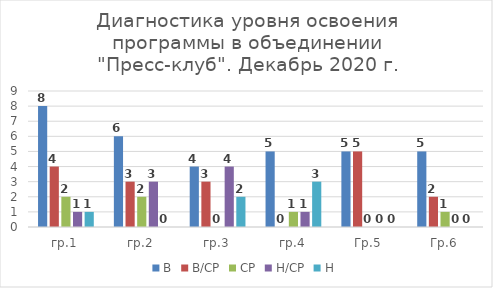
| Category | В | В/СР | СР | Н/СР | Н |
|---|---|---|---|---|---|
| гр.1 | 8 | 4 | 2 | 1 | 1 |
| гр.2 | 6 | 3 | 2 | 3 | 0 |
| гр.3 | 4 | 3 | 0 | 4 | 2 |
| гр.4 | 5 | 0 | 1 | 1 | 3 |
| Гр.5 | 5 | 5 | 0 | 0 | 0 |
| Гр.6 | 5 | 2 | 1 | 0 | 0 |